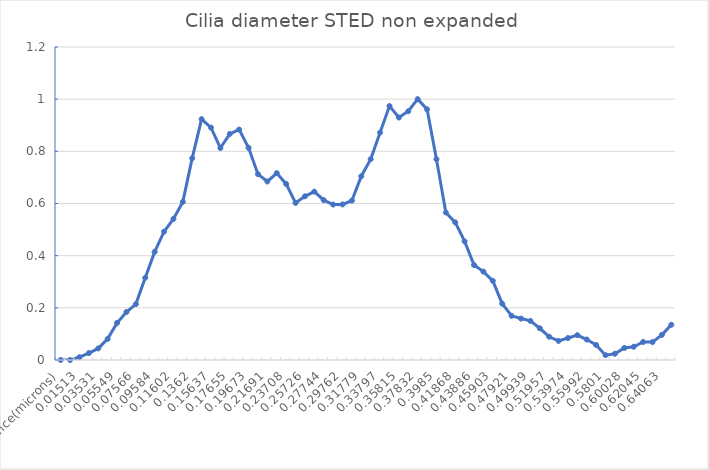
| Category | Series 0 |
|---|---|
| Distance(microns) | 0 |
| 0,00504 | 0 |
| 0,01513 | 0.011 |
| 0,02522 | 0.026 |
| 0,03531 | 0.044 |
| 0,0454 | 0.081 |
| 0,05549 | 0.142 |
| 0,06558 | 0.184 |
| 0,07566 | 0.214 |
| 0,08575 | 0.315 |
| 0,09584 | 0.414 |
| 0,10593 | 0.492 |
| 0,11602 | 0.541 |
| 0,12611 | 0.606 |
| 0,1362 | 0.774 |
| 0,14629 | 0.923 |
| 0,15637 | 0.891 |
| 0,16646 | 0.813 |
| 0,17655 | 0.867 |
| 0,18664 | 0.884 |
| 0,19673 | 0.814 |
| 0,20682 | 0.713 |
| 0,21691 | 0.684 |
| 0,22699 | 0.717 |
| 0,23708 | 0.675 |
| 0,24717 | 0.602 |
| 0,25726 | 0.628 |
| 0,26735 | 0.646 |
| 0,27744 | 0.613 |
| 0,28753 | 0.596 |
| 0,29762 | 0.596 |
| 0,3077 | 0.611 |
| 0,31779 | 0.705 |
| 0,32788 | 0.77 |
| 0,33797 | 0.872 |
| 0,34806 | 0.974 |
| 0,35815 | 0.93 |
| 0,36824 | 0.954 |
| 0,37832 | 1 |
| 0,38841 | 0.961 |
| 0,3985 | 0.77 |
| 0,40859 | 0.565 |
| 0,41868 | 0.528 |
| 0,42877 | 0.455 |
| 0,43886 | 0.364 |
| 0,44895 | 0.339 |
| 0,45903 | 0.303 |
| 0,46912 | 0.216 |
| 0,47921 | 0.169 |
| 0,4893 | 0.159 |
| 0,49939 | 0.15 |
| 0,50948 | 0.122 |
| 0,51957 | 0.089 |
| 0,52965 | 0.073 |
| 0,53974 | 0.084 |
| 0,54983 | 0.095 |
| 0,55992 | 0.078 |
| 0,57001 | 0.058 |
| 0,5801 | 0.018 |
| 0,59019 | 0.024 |
| 0,60028 | 0.046 |
| 0,61036 | 0.051 |
| 0,62045 | 0.069 |
| 0,63054 | 0.069 |
| 0,64063 | 0.096 |
| 0,65072 | 0.135 |